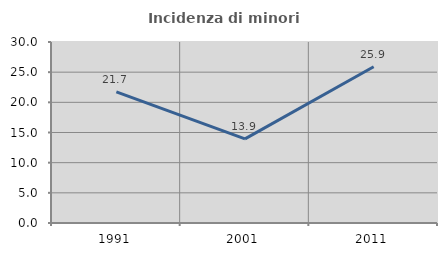
| Category | Incidenza di minori stranieri |
|---|---|
| 1991.0 | 21.739 |
| 2001.0 | 13.934 |
| 2011.0 | 25.897 |